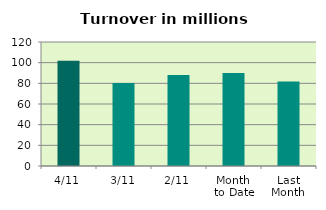
| Category | Series 0 |
|---|---|
| 4/11 | 101.928 |
| 3/11 | 80.33 |
| 2/11 | 88.003 |
| Month 
to Date | 90.087 |
| Last
Month | 81.795 |